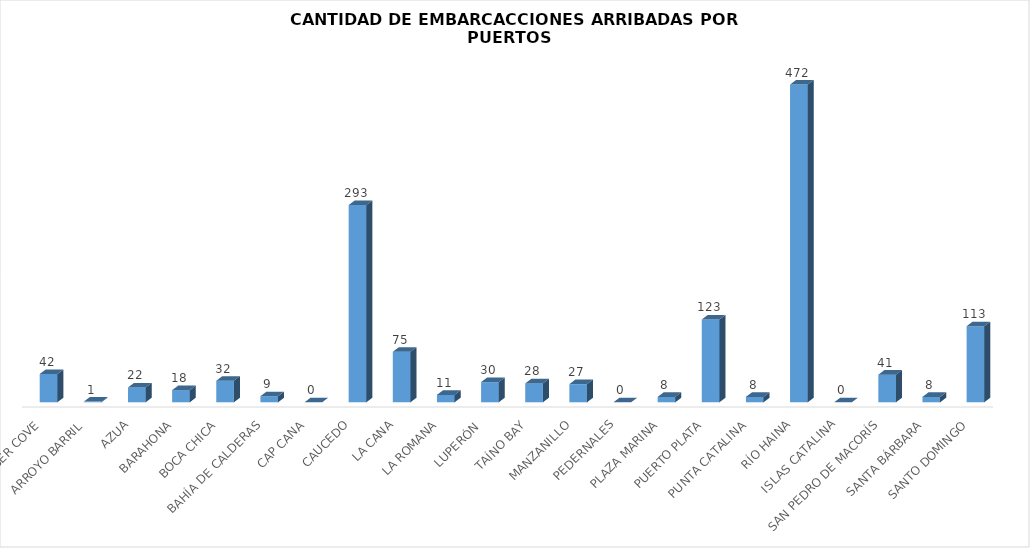
| Category | Series 0 |
|---|---|
| AMBER COVE | 42 |
| ARROYO BARRIL | 1 |
| AZUA | 22 |
| BARAHONA | 18 |
| BOCA CHICA | 32 |
| BAHÍA DE CALDERAS | 9 |
| CAP CANA | 0 |
| CAUCEDO | 293 |
| LA CANA | 75 |
| LA ROMANA | 11 |
| LUPERÓN  | 30 |
| TAÍNO BAY | 28 |
| MANZANILLO | 27 |
| PEDERNALES | 0 |
| PLAZA MARINA | 8 |
| PUERTO PLATA | 123 |
| PUNTA CATALINA | 8 |
| RÍO HAINA | 472 |
| ISLAS CATALINA | 0 |
| SAN PEDRO DE MACORÍS | 41 |
| SANTA BÁRBARA | 8 |
| SANTO DOMINGO | 113 |